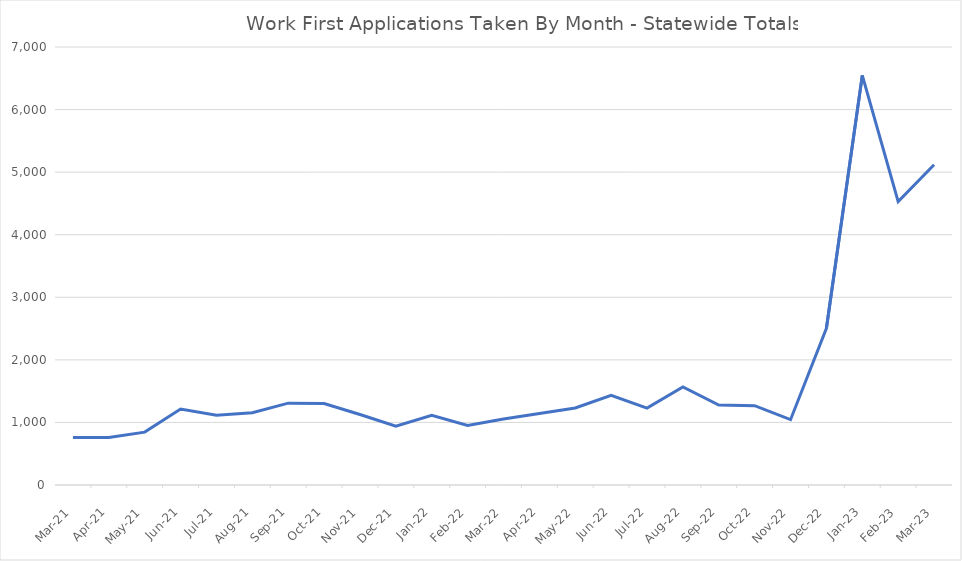
| Category | Series 0 |
|---|---|
| 2023-03-23 | 5117 |
| 2023-02-01 | 4530 |
| 2023-01-01 | 6546 |
| 2022-12-01 | 2505 |
| 2022-11-22 | 1044 |
| 2022-10-22 | 1268 |
| 2022-09-22 | 1279 |
| 2022-08-22 | 1568 |
| 2022-07-22 | 1228 |
| 2022-06-01 | 1433 |
| 2022-05-01 | 1230 |
| 2022-04-01 | 1142 |
| 2022-03-01 | 1056 |
| 2022-02-01 | 953 |
| 2022-01-01 | 1113 |
| 2021-12-02 | 940 |
| 2021-11-01 | 1127 |
| 2021-10-01 | 1301 |
| 2021-09-01 | 1308 |
| 2021-08-01 | 1156 |
| 2021-07-01 | 1115 |
| 2021-06-01 | 1214 |
| 2021-05-01 | 845 |
| 2021-04-01 | 759 |
| 2021-03-01 | 760 |